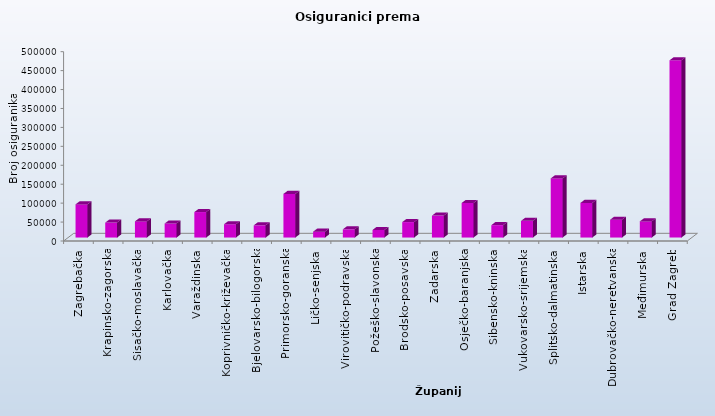
| Category | Series 0 |
|---|---|
| Zagrebačka | 87561 |
| Krapinsko-zagorska | 39524 |
| Sisačko-moslavačka | 42628 |
| Karlovačka | 37038 |
| Varaždinska | 67282 |
| Koprivničko-križevačka | 35133 |
| Bjelovarsko-bilogorska | 32238 |
| Primorsko-goranska | 115185 |
| Ličko-senjska | 15521 |
| Virovitičko-podravska | 21639 |
| Požeško-slavonska | 20000 |
| Brodsko-posavska | 40791 |
| Zadarska | 57903 |
| Osječko-baranjska | 91281 |
| Šibensko-kninska | 32790 |
| Vukovarsko-srijemska | 44036 |
| Splitsko-dalmatinska | 156126 |
| Istarska | 91416 |
| Dubrovačko-neretvanska | 47072 |
| Međimurska | 42607 |
| Grad Zagreb | 468058 |